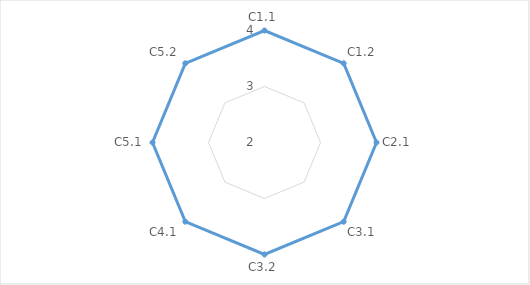
| Category | Series 0 | "" | 1 | 2 | 3 | 4 |
|---|---|---|---|---|---|---|
| C1.1 | 4 |  |  |  |  |  |
| C1.2 | 4 |  |  |  |  |  |
| C2.1 | 4 |  |  |  |  |  |
| C3.1 | 4 |  |  |  |  |  |
| C3.2 | 4 |  |  |  |  |  |
| C4.1 | 4 |  |  |  |  |  |
| C5.1 | 4 |  |  |  |  |  |
| C5.2 | 4 |  |  |  |  |  |